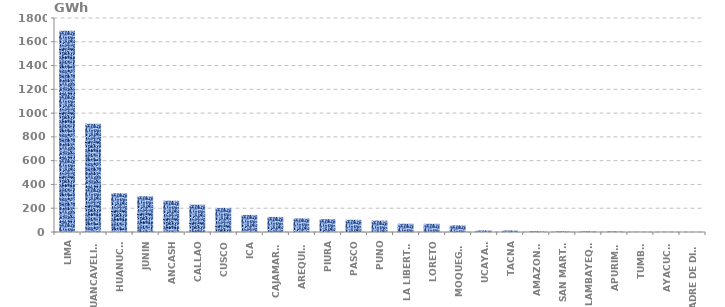
| Category | Series 0 |
|---|---|
| LIMA | 1693.577 |
| HUANCAVELICA | 909.738 |
| HUANUCO | 325.594 |
| JUNIN | 300.433 |
| ANCASH | 263.118 |
| CALLAO | 229.798 |
| CUSCO | 202.424 |
| ICA | 143.678 |
| CAJAMARCA | 126.814 |
| AREQUIPA | 114.21 |
| PIURA | 108.369 |
| PASCO | 102.705 |
| PUNO | 95.684 |
| LA LIBERTAD | 69.493 |
| LORETO | 69.007 |
| MOQUEGUA | 55.491 |
| UCAYALI | 13.121 |
| TACNA | 13.026 |
| AMAZONAS | 5.809 |
| SAN MARTÍN | 5.529 |
| LAMBAYEQUE | 5.366 |
| APURIMAC | 4.57 |
| TUMBES | 1.148 |
| AYACUCHO | 0.769 |
| MADRE DE DIOS | 0.145 |